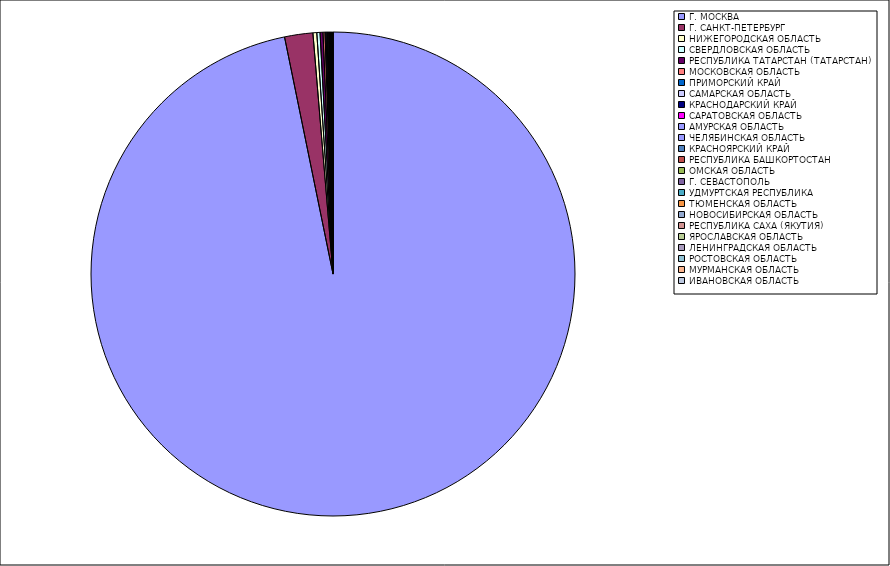
| Category | Оборот |
|---|---|
| Г. МОСКВА | 96.736 |
| Г. САНКТ-ПЕТЕРБУРГ | 1.885 |
| НИЖЕГОРОДСКАЯ ОБЛАСТЬ | 0.257 |
| СВЕРДЛОВСКАЯ ОБЛАСТЬ | 0.214 |
| РЕСПУБЛИКА ТАТАРСТАН (ТАТАРСТАН) | 0.195 |
| МОСКОВСКАЯ ОБЛАСТЬ | 0.131 |
| ПРИМОРСКИЙ КРАЙ | 0.069 |
| САМАРСКАЯ ОБЛАСТЬ | 0.063 |
| КРАСНОДАРСКИЙ КРАЙ | 0.057 |
| САРАТОВСКАЯ ОБЛАСТЬ | 0.055 |
| АМУРСКАЯ ОБЛАСТЬ | 0.039 |
| ЧЕЛЯБИНСКАЯ ОБЛАСТЬ | 0.037 |
| КРАСНОЯРСКИЙ КРАЙ | 0.034 |
| РЕСПУБЛИКА БАШКОРТОСТАН | 0.026 |
| ОМСКАЯ ОБЛАСТЬ | 0.024 |
| Г. СЕВАСТОПОЛЬ | 0.02 |
| УДМУРТСКАЯ РЕСПУБЛИКА | 0.02 |
| ТЮМЕНСКАЯ ОБЛАСТЬ | 0.019 |
| НОВОСИБИРСКАЯ ОБЛАСТЬ | 0.018 |
| РЕСПУБЛИКА САХА (ЯКУТИЯ) | 0.01 |
| ЯРОСЛАВСКАЯ ОБЛАСТЬ | 0.008 |
| ЛЕНИНГРАДСКАЯ ОБЛАСТЬ | 0.008 |
| РОСТОВСКАЯ ОБЛАСТЬ | 0.007 |
| МУРМАНСКАЯ ОБЛАСТЬ | 0.006 |
| ИВАНОВСКАЯ ОБЛАСТЬ | 0.005 |